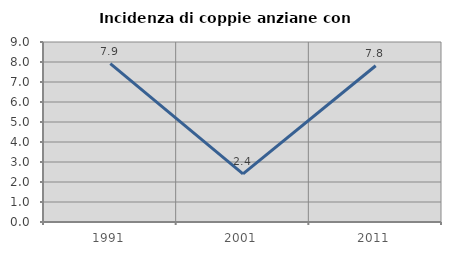
| Category | Incidenza di coppie anziane con figli |
|---|---|
| 1991.0 | 7.921 |
| 2001.0 | 2.41 |
| 2011.0 | 7.812 |